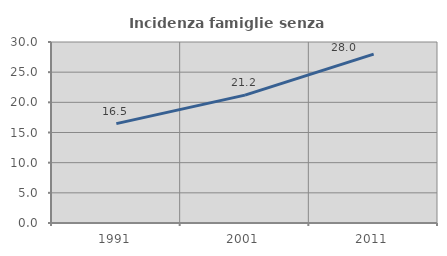
| Category | Incidenza famiglie senza nuclei |
|---|---|
| 1991.0 | 16.469 |
| 2001.0 | 21.191 |
| 2011.0 | 27.997 |